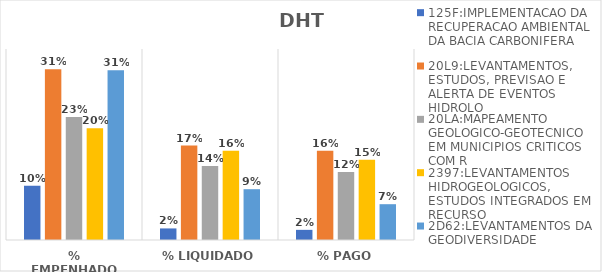
| Category | 125F:IMPLEMENTACAO DA RECUPERACAO AMBIENTAL DA BACIA CARBONIFERA | 20L9:LEVANTAMENTOS, ESTUDOS, PREVISAO E ALERTA DE EVENTOS HIDROLO | 20LA:MAPEAMENTO GEOLOGICO-GEOTECNICO EM MUNICIPIOS CRITICOS COM R | 2397:LEVANTAMENTOS HIDROGEOLOGICOS, ESTUDOS INTEGRADOS EM RECURSO | 2D62:LEVANTAMENTOS DA GEODIVERSIDADE |
|---|---|---|---|---|---|
| % EMPENHADO | 0.099 | 0.313 | 0.225 | 0.205 | 0.311 |
| % LIQUIDADO | 0.021 | 0.173 | 0.136 | 0.163 | 0.093 |
| % PAGO | 0.019 | 0.163 | 0.125 | 0.147 | 0.066 |